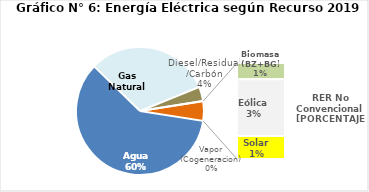
| Category | Series 0 |
|---|---|
| Agua | 2901.902 |
| Gas Natural | 1533.723 |
| Diesel/Residual/Carbón | 175.521 |
| Vapor (Cogeneracion) | 0.38 |
| Biomasa (BZ+BG) | 40.871 |
| Eólica | 142.651 |
| Solar | 57.423 |